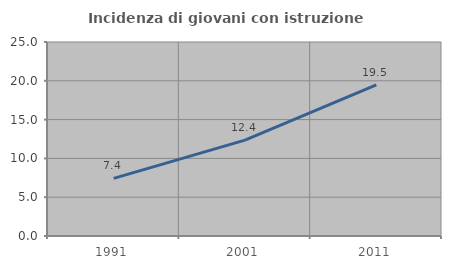
| Category | Incidenza di giovani con istruzione universitaria |
|---|---|
| 1991.0 | 7.429 |
| 2001.0 | 12.352 |
| 2011.0 | 19.466 |